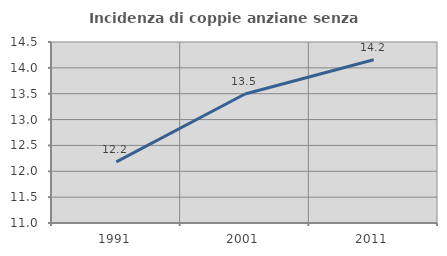
| Category | Incidenza di coppie anziane senza figli  |
|---|---|
| 1991.0 | 12.182 |
| 2001.0 | 13.495 |
| 2011.0 | 14.156 |